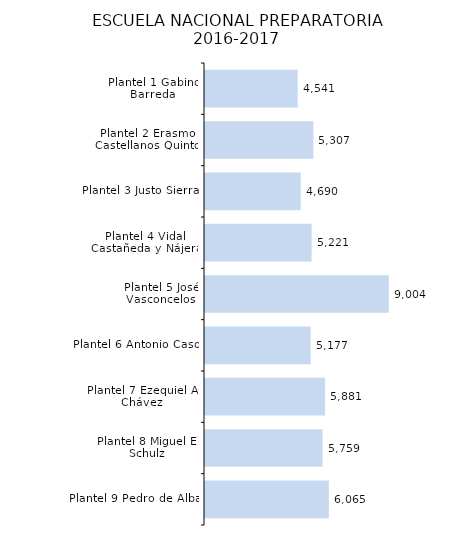
| Category | Series 0 |
|---|---|
| Plantel 9 Pedro de Alba | 6065 |
| Plantel 8 Miguel E. Schulz | 5759 |
| Plantel 7 Ezequiel A. Chávez | 5881 |
| Plantel 6 Antonio Caso | 5177 |
| Plantel 5 José Vasconcelos | 9004 |
| Plantel 4 Vidal Castañeda y Nájera | 5221 |
| Plantel 3 Justo Sierra | 4690 |
| Plantel 2 Erasmo Castellanos Quinto | 5307 |
| Plantel 1 Gabino Barreda | 4541 |